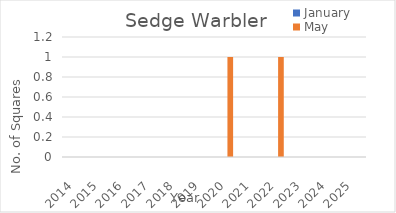
| Category | January | May |
|---|---|---|
| 2014.0 | 0 | 0 |
| 2015.0 | 0 | 0 |
| 2016.0 | 0 | 0 |
| 2017.0 | 0 | 0 |
| 2018.0 | 0 | 0 |
| 2019.0 | 0 | 0 |
| 2020.0 | 0 | 1 |
| 2021.0 | 0 | 0 |
| 2022.0 | 0 | 1 |
| 2023.0 | 0 | 0 |
| 2024.0 | 0 | 0 |
| 2025.0 | 0 | 0 |